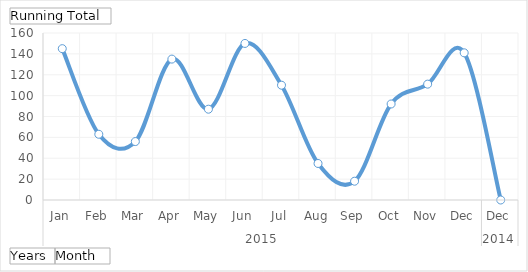
| Category | Total |
|---|---|
| 0 | 145 |
| 1 | 63 |
| 2 | 56 |
| 3 | 135 |
| 4 | 87 |
| 5 | 150 |
| 6 | 110 |
| 7 | 35 |
| 8 | 18 |
| 9 | 92 |
| 10 | 111 |
| 11 | 141 |
| 12 | 0 |